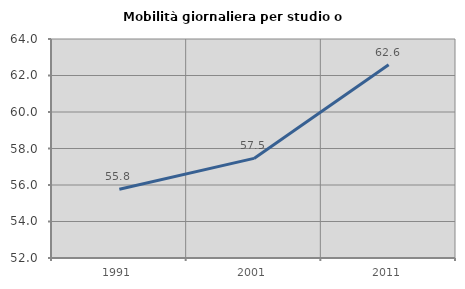
| Category | Mobilità giornaliera per studio o lavoro |
|---|---|
| 1991.0 | 55.767 |
| 2001.0 | 57.458 |
| 2011.0 | 62.584 |